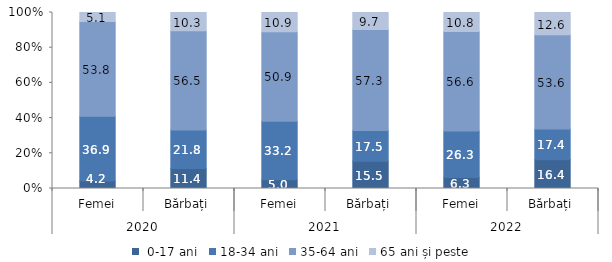
| Category |  0-17 ani | 18-34 ani | 35-64 ani | 65 ani și peste |
|---|---|---|---|---|
| 0 | 4.2 | 36.9 | 53.8 | 5.1 |
| 1 | 11.4 | 21.8 | 56.5 | 10.3 |
| 2 | 5 | 33.2 | 50.9 | 10.9 |
| 3 | 15.5 | 17.5 | 57.3 | 9.7 |
| 4 | 6.3 | 26.3 | 56.6 | 10.8 |
| 5 | 16.4 | 17.4 | 53.6 | 12.6 |